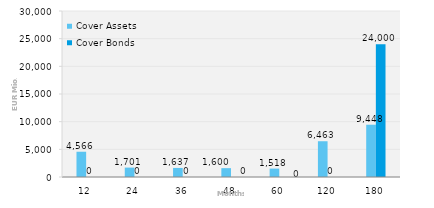
| Category | Cover Assets | Cover Bonds |
|---|---|---|
| 12.0 | 4566.217 | 0 |
| 24.0 | 1700.704 | 0 |
| 36.0 | 1637.233 | 0 |
| 48.0 | 1599.598 | 0 |
| 60.0 | 1518.326 | 0 |
| 120.0 | 6462.861 | 0 |
| 180.0 | 9447.52 | 24000 |